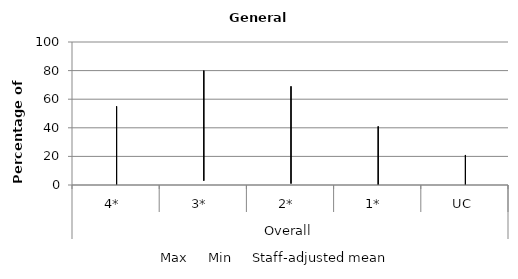
| Category | Max | Min | Staff-adjusted mean |
|---|---|---|---|
| 0 | 55 | 0 | 26 |
| 1 | 80 | 3 | 56 |
| 2 | 69 | 1 | 16 |
| 3 | 41 | 0 | 2 |
| 4 | 21 | 0 | 0 |